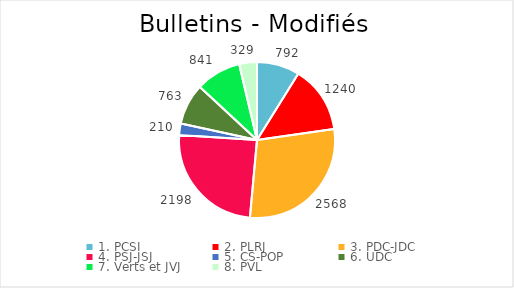
| Category | Series 0 |
|---|---|
| 1. PCSI | 792 |
| 2. PLRJ | 1240 |
| 3. PDC-JDC | 2568 |
| 4. PSJ-JSJ | 2198 |
| 5. CS-POP | 210 |
| 6. UDC | 763 |
| 7. Verts et JVJ | 841 |
| 8. PVL | 329 |